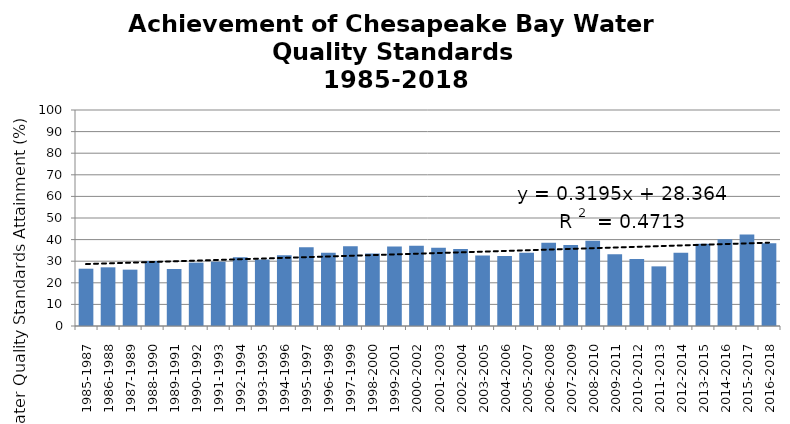
| Category | Area-Weighted |
|---|---|
| 1985-1987 | 26.526 |
| 1986-1988 | 27.168 |
| 1987-1989 | 26.092 |
| 1988-1990 | 30.105 |
| 1989-1991 | 26.377 |
| 1990-1992 | 29.329 |
| 1991-1993 | 29.797 |
| 1992-1994 | 31.788 |
| 1993-1995 | 30.773 |
| 1994-1996 | 32.71 |
| 1995-1997 | 36.504 |
| 1996-1998 | 33.874 |
| 1997-1999 | 36.868 |
| 1998-2000 | 33.544 |
| 1999-2001 | 36.835 |
| 2000-2002 | 37.158 |
| 2001-2003 | 36.175 |
| 2002-2004 | 35.678 |
| 2003-2005 | 32.677 |
| 2004-2006 | 32.384 |
| 2005-2007 | 33.912 |
| 2006-2008 | 38.529 |
| 2007-2009 | 37.449 |
| 2008-2010 | 39.51 |
| 2009-2011 | 33.182 |
| 2010-2012 | 30.993 |
| 2011-2013 | 27.61 |
| 2012-2014 | 33.942 |
| 2013-2015 | 38.06 |
| 2014-2016 | 40.165 |
| 2015-2017 | 42.325 |
| 2016-2018 | 38.315 |